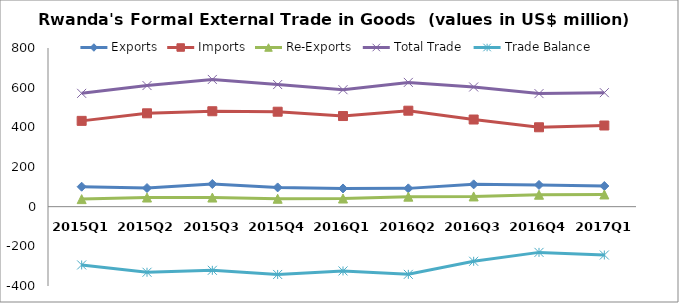
| Category | Exports | Imports | Re-Exports | Total Trade | Trade Balance |
|---|---|---|---|---|---|
| 2015Q1 | 100.645 | 432.606 | 38.092 | 571.343 | -293.87 |
| 2015Q2 | 93.892 | 470.703 | 46.126 | 610.721 | -330.685 |
| 2015Q3 | 114.24 | 481.145 | 46.053 | 641.438 | -320.853 |
| 2015Q4 | 97.026 | 478.754 | 39.897 | 615.677 | -341.831 |
| 2016Q1 | 91.795 | 456.929 | 41.031 | 589.755 | -324.103 |
| 2016Q2 | 92.237 | 483.863 | 50.433 | 626.533 | -341.192 |
| 2016Q3 | 112.536 | 439.389 | 51.515 | 603.44 | -275.338 |
| 2016Q4 | 109.503 | 400.306 | 60.303 | 570.112 | -230.5 |
| 2017Q1 | 104.064 | 409.239 | 61.473 | 574.776 | -243.702 |